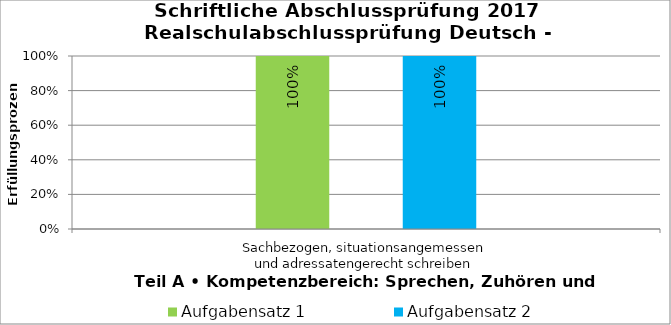
| Category | Aufgabensatz 1 | Aufgabensatz 2 |
|---|---|---|
| Sachbezogen, situationsangemessen
und adressatengerecht schreiben | 1 | 1 |